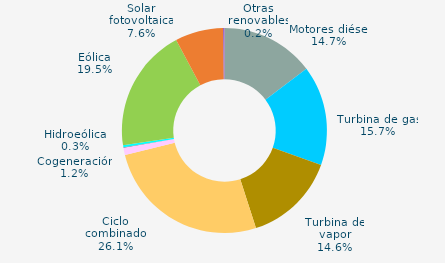
| Category | Series 0 |
|---|---|
| Motores diésel | 14.729 |
| Turbina de gas | 15.729 |
| Turbina de vapor | 14.578 |
| Ciclo combinado | 26.138 |
| Cogeneración | 1.154 |
| Hidráulica | 0.046 |
| Hidroeólica | 0.342 |
| Eólica | 19.472 |
| Solar fotovoltaica | 7.589 |
| Otras renovables | 0.225 |